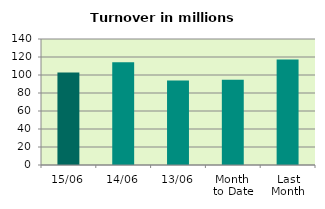
| Category | Series 0 |
|---|---|
| 15/06 | 102.915 |
| 14/06 | 114.137 |
| 13/06 | 93.877 |
| Month 
to Date | 94.783 |
| Last
Month | 117.306 |